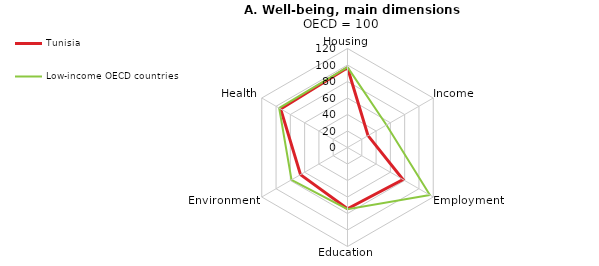
| Category | Tunisia | Low-income OECD countries |
|---|---|---|
| Housing | 96.67 | 97.381 |
| Income | 28.72 | 54.531 |
| Employment | 77.677 | 115.304 |
| Education | 74.268 | 74.855 |
| Environment | 65.772 | 78.369 |
| Health | 93.602 | 95.651 |